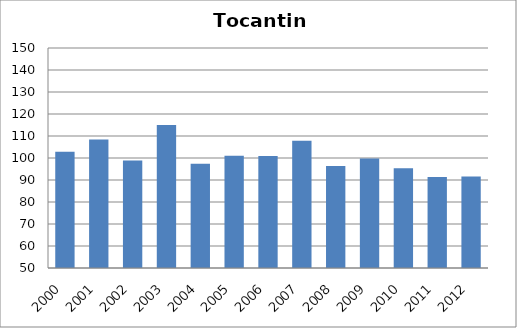
| Category | Tríplice viral/sarampo |
|---|---|
| 2000.0 | 102.88 |
| 2001.0 | 108.37 |
| 2002.0 | 98.91 |
| 2003.0 | 115.03 |
| 2004.0 | 97.41 |
| 2005.0 | 101 |
| 2006.0 | 100.96 |
| 2007.0 | 107.82 |
| 2008.0 | 96.4 |
| 2009.0 | 99.77 |
| 2010.0 | 95.33 |
| 2011.0 | 91.41 |
| 2012.0 | 91.6 |